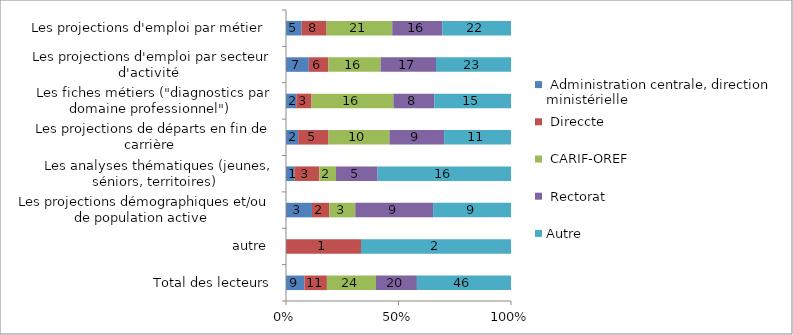
| Category |  Administration centrale, direction ministérielle  |  Direccte  |  CARIF-OREF  |  Rectorat  | Autre |
|---|---|---|---|---|---|
|  Total des lecteurs | 9 | 11 | 24 | 20 | 46 |
|  autre  | 0 | 1 | 0 | 0 | 2 |
|  Les projections démographiques et/ou de population active  | 3 | 2 | 3 | 9 | 9 |
|  Les analyses thématiques (jeunes, séniors, territoires)  | 1 | 3 | 2 | 5 | 16 |
|  Les projections de départs en fin de carrière  | 2 | 5 | 10 | 9 | 11 |
|  Les fiches métiers ("diagnostics par domaine professionnel")  | 2 | 3 | 16 | 8 | 15 |
|  Les projections d'emploi par secteur d'activité  | 7 | 6 | 16 | 17 | 23 |
|  Les projections d'emploi par métier  | 5 | 8 | 21 | 16 | 22 |